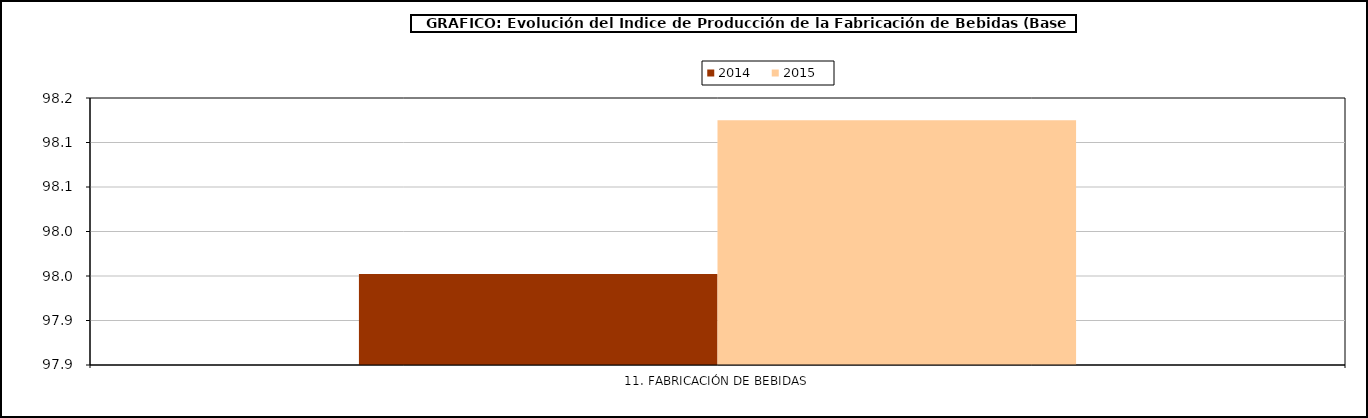
| Category | 2014 | 2015 |
|---|---|---|
| 11. FABRICACIÓN DE BEBIDAS | 97.952 | 98.125 |